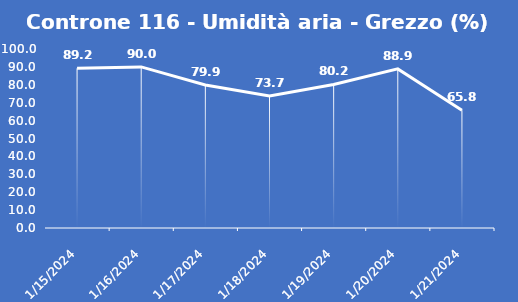
| Category | Controne 116 - Umidità aria - Grezzo (%) |
|---|---|
| 1/15/24 | 89.2 |
| 1/16/24 | 90 |
| 1/17/24 | 79.9 |
| 1/18/24 | 73.7 |
| 1/19/24 | 80.2 |
| 1/20/24 | 88.9 |
| 1/21/24 | 65.8 |